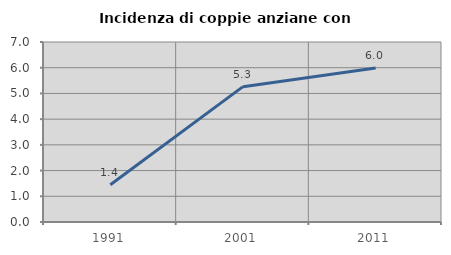
| Category | Incidenza di coppie anziane con figli |
|---|---|
| 1991.0 | 1.449 |
| 2001.0 | 5.263 |
| 2011.0 | 5.993 |